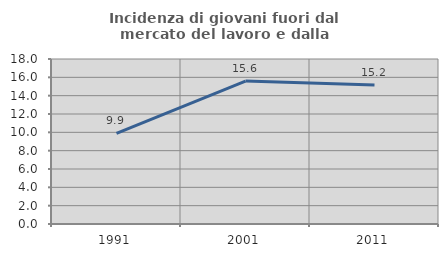
| Category | Incidenza di giovani fuori dal mercato del lavoro e dalla formazione  |
|---|---|
| 1991.0 | 9.884 |
| 2001.0 | 15.595 |
| 2011.0 | 15.168 |